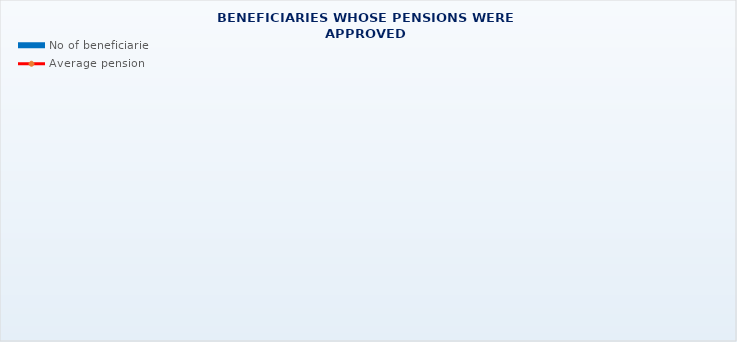
| Category | No of beneficiaries |
|---|---|
| Authorised officials in internal affairs, judicial officers and workers engaged in demining work: | 17264 |
| Pension beneficiaries entitled under the Fire Services Act (Official Gazette 125/19)* | 148 |
| Active military personnel - DVO  | 15865 |
| Croatian Homeland Army veterans mobilised from 1941 to 1945 | 2977 |
| Former political prisoners | 2499 |
| Croatian Veterans from the Homeland War - ZOHBDR (Act on Croatian Homeland War Veterans and Their Family Members) | 70838 |
| Pensions approved under general regulations and determined according to the Act on the Rights of Croatian Homeland War Veterans and their Family Members (ZOHBDR), in 2017 (Art. 27, 35, 48 and 49, paragraph 2)    | 48790 |
| Former Yugoslav People's Army members - JNA   | 4642 |
| Former Yugoslav People's Army members - JNA - Art. 185 of Pension Insurance Act (ZOMO)  | 159 |
| National Liberation War veterans - NOR | 7356 |
| Members of the Croatian Parliament, members of the Government, judges of the Constitutional Court and the Auditor General | 687 |
| Members of the Parliamentary Executive Council and administratively retired federal civil servants  (relates to the former SFRY) | 79 |
| Former officials of federal bodies o the former SFRJ -  Article 38 of the Pension Insurance Act (ZOMO) | 29 |
| Full members of the Croatian Academy of Sciences and Arts - HAZU | 132 |
| Miners from the Istrian coal mines "Tupljak" d.d. Labin  | 247 |
| Workers professionally exposed to asbestos | 859 |
| Insurees - crew members on a ship in international and national navigation  - Article  129, paragraph 2 of the Maritime Code | 199 |
| Members of the Croatian Defence Council - HVO  | 6762 |